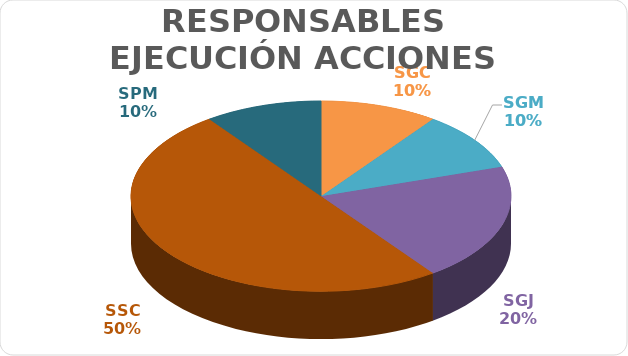
| Category | Series 0 |
|---|---|
| SGC | 1 |
| SGM | 1 |
| SGJ | 2 |
| SSC | 5 |
| SPM | 1 |